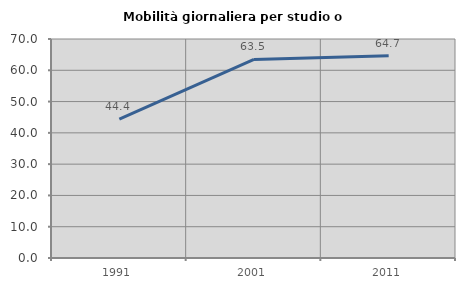
| Category | Mobilità giornaliera per studio o lavoro |
|---|---|
| 1991.0 | 44.375 |
| 2001.0 | 63.478 |
| 2011.0 | 64.677 |